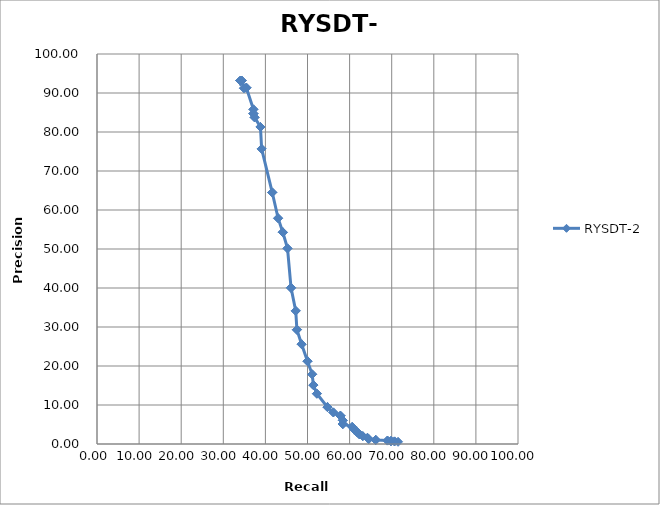
| Category | RYSDT-2 |
|---|---|
| 34.078 | 93.13 |
| 34.078 | 93.13 |
| 34.078 | 93.13 |
| 34.078 | 93.13 |
| 34.078 | 93.13 |
| 34.078 | 93.13 |
| 34.078 | 93.13 |
| 34.078 | 93.13 |
| 34.078 | 93.13 |
| 34.078 | 93.13 |
| 34.358 | 93.182 |
| 34.358 | 93.182 |
| 34.358 | 93.182 |
| 34.916 | 91.241 |
| 34.916 | 91.241 |
| 35.475 | 91.367 |
| 35.475 | 91.367 |
| 35.475 | 91.367 |
| 37.151 | 85.806 |
| 37.151 | 85.806 |
| 37.151 | 84.713 |
| 37.151 | 84.713 |
| 37.151 | 84.713 |
| 37.43 | 83.75 |
| 37.43 | 83.75 |
| 38.827 | 81.287 |
| 38.827 | 81.287 |
| 38.827 | 81.287 |
| 39.106 | 75.676 |
| 39.106 | 75.676 |
| 41.62 | 64.502 |
| 41.62 | 64.502 |
| 41.62 | 64.502 |
| 43.017 | 57.895 |
| 43.017 | 57.895 |
| 44.134 | 54.296 |
| 44.134 | 54.296 |
| 44.134 | 54.296 |
| 45.251 | 50.155 |
| 45.251 | 50.155 |
| 46.089 | 40.049 |
| 46.089 | 40.049 |
| 46.089 | 40.049 |
| 47.207 | 34.141 |
| 47.207 | 34.141 |
| 47.486 | 29.31 |
| 47.486 | 29.31 |
| 47.486 | 29.31 |
| 48.603 | 25.588 |
| 48.603 | 25.588 |
| 50.0 | 21.234 |
| 50.0 | 21.234 |
| 50.0 | 21.234 |
| 51.117 | 17.871 |
| 51.117 | 17.871 |
| 51.397 | 15.107 |
| 51.397 | 15.107 |
| 51.397 | 15.107 |
| 52.235 | 12.905 |
| 52.235 | 12.905 |
| 54.749 | 9.459 |
| 54.749 | 9.459 |
| 54.749 | 9.459 |
| 56.145 | 8.102 |
| 56.145 | 8.102 |
| 57.821 | 7.261 |
| 57.821 | 7.261 |
| 57.821 | 7.261 |
| 58.38 | 6.083 |
| 58.38 | 6.083 |
| 58.38 | 5.128 |
| 58.38 | 5.128 |
| 58.38 | 5.128 |
| 60.615 | 4.383 |
| 60.615 | 4.383 |
| 61.173 | 3.691 |
| 61.173 | 3.691 |
| 61.173 | 3.691 |
| 61.732 | 3.084 |
| 61.732 | 3.084 |
| 62.291 | 2.539 |
| 62.291 | 2.539 |
| 62.291 | 2.539 |
| 63.128 | 2.017 |
| 63.128 | 2.017 |
| 64.246 | 1.581 |
| 64.246 | 1.581 |
| 64.246 | 1.581 |
| 64.525 | 1.266 |
| 64.525 | 1.266 |
| 66.201 | 1.039 |
| 66.201 | 1.039 |
| 66.201 | 1.039 |
| 68.994 | 0.884 |
| 68.994 | 0.884 |
| 69.832 | 0.765 |
| 69.832 | 0.765 |
| 69.832 | 0.765 |
| 70.67 | 0.665 |
| 70.67 | 0.665 |
| 71.508 | 0.564 |